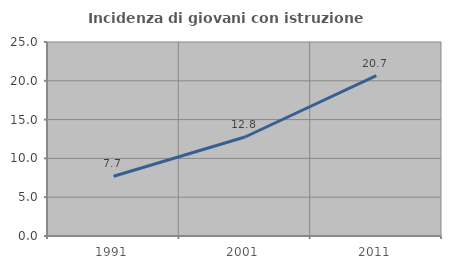
| Category | Incidenza di giovani con istruzione universitaria |
|---|---|
| 1991.0 | 7.692 |
| 2001.0 | 12.757 |
| 2011.0 | 20.667 |